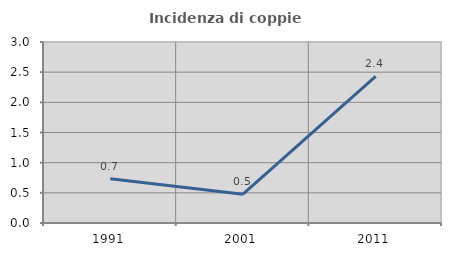
| Category | Incidenza di coppie miste |
|---|---|
| 1991.0 | 0.734 |
| 2001.0 | 0.478 |
| 2011.0 | 2.431 |